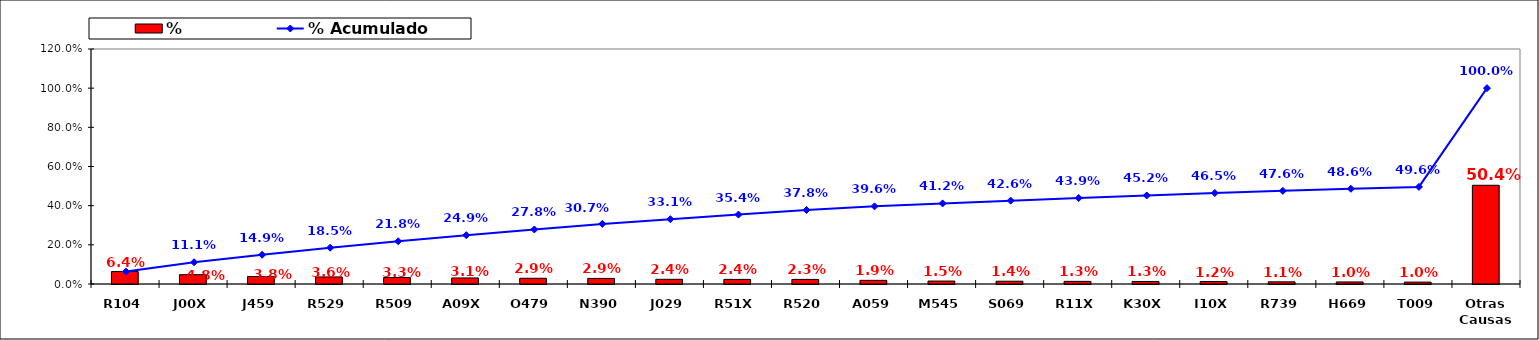
| Category | % |
|---|---|
| R104 | 0.064 |
| J00X | 0.048 |
| J459 | 0.038 |
| R529 | 0.036 |
| R509 | 0.033 |
| A09X | 0.031 |
| O479 | 0.029 |
| N390 | 0.029 |
| J029 | 0.024 |
| R51X | 0.024 |
| R520 | 0.023 |
| A059 | 0.019 |
| M545 | 0.015 |
| S069 | 0.014 |
| R11X | 0.013 |
| K30X | 0.013 |
| I10X | 0.012 |
| R739 | 0.011 |
| H669 | 0.01 |
| T009 | 0.01 |
| Otras Causas | 0.504 |